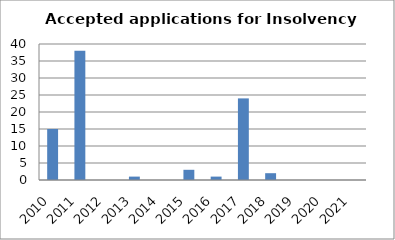
| Category | Series 0 |
|---|---|
| 2010.0 | 15 |
| 2011.0 | 38 |
| 2012.0 | 0 |
| 2013.0 | 1 |
| 2014.0 | 0 |
| 2015.0 | 3 |
| 2016.0 | 1 |
| 2017.0 | 24 |
| 2018.0 | 2 |
| 2019.0 | 0 |
| 2020.0 | 0 |
| 2021.0 | 0 |